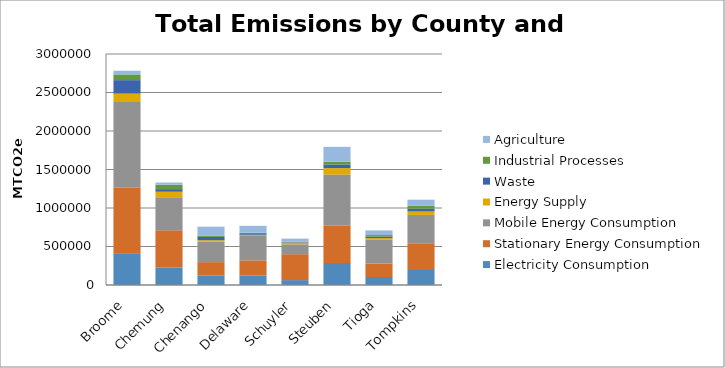
| Category | Electricity Consumption | Stationary Energy Consumption | Mobile Energy Consumption | Energy Supply | Waste  | Industrial Processes | Agriculture |
|---|---|---|---|---|---|---|---|
| Broome | 413119.253 | 849133.678 | 1113793.058 | 109279.382 | 175148.18 | 74458.598 | 47684.949 |
| Chemung | 229614.791 | 480217.335 | 429744.921 | 71550.658 | 34073.695 | 58124.371 | 27598.663 |
| Chenango | 121263.037 | 175679.459 | 266071.309 | 18942.653 | 42559.109 | 18736.025 | 114366.666 |
| Delaware | 121380.246 | 198143.069 | 317300.15 | 12822.141 | 10609.131 | 17809.19 | 90368.517 |
| Schuyler | 63811.463 | 336576.027 | 128015.308 | 22505.457 | 6254.176 | 6808.545 | 38648.494 |
| Steuben | 286554.041 | 483033.209 | 664109.524 | 84587.38 | 47799.106 | 35969.145 | 192276.022 |
| Tioga | 103778.995 | 174222.686 | 314331.002 | 16245.682 | 21001.016 | 18976.55 | 60525.82 |
| Tompkins | 207226.414 | 335270.119 | 367986.337 | 44309.617 | 35538.081 | 37698.47 | 79919.437 |